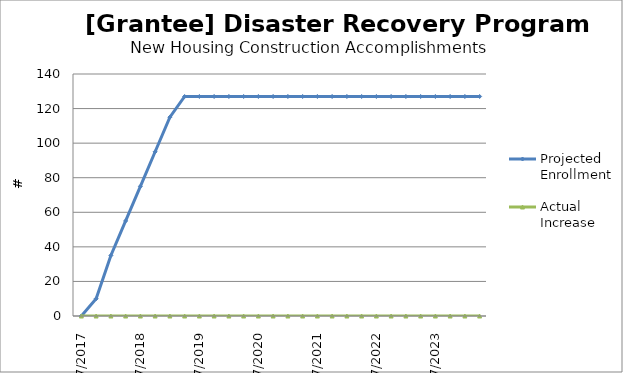
| Category | Projected Enrollment | Actual Increase |
|---|---|---|
| 7/2017 | 0 | 0 |
| 10/2017 | 10 | 0 |
| 1/2018 | 35 | 0 |
| 4/2018 | 55 | 0 |
| 7/2018 | 75 | 0 |
| 10/2018 | 95 | 0 |
| 1/2019 | 115 | 0 |
| 4/2019 | 127 | 0 |
| 7/2019 | 127 | 0 |
| 10/2019 | 127 | 0 |
| 1/2020 | 127 | 0 |
| 4/2020 | 127 | 0 |
| 7/2020 | 127 | 0 |
| 10/2020 | 127 | 0 |
| 1/2021 | 127 | 0 |
| 4/2021 | 127 | 0 |
| 7/2021 | 127 | 0 |
| 10/2021 | 127 | 0 |
| 1/2022 | 127 | 0 |
| 4/2022 | 127 | 0 |
| 7/2022 | 127 | 0 |
| 10/2022 | 127 | 0 |
| 1/2023 | 127 | 0 |
| 4/2023 | 127 | 0 |
| 7/2023 | 127 | 0 |
| 10/2023 | 127 | 0 |
| 1/2024 | 127 | 0 |
| 4/2024 | 127 | 0 |